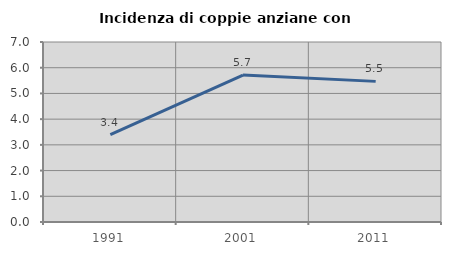
| Category | Incidenza di coppie anziane con figli |
|---|---|
| 1991.0 | 3.401 |
| 2001.0 | 5.714 |
| 2011.0 | 5.469 |